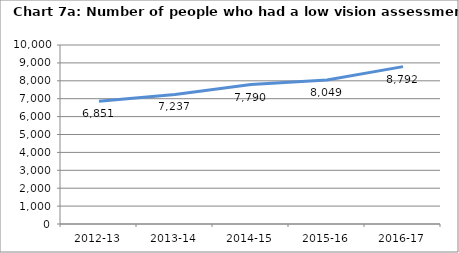
| Category | Chart 7a: Number of people who had a low vision assessment |
|---|---|
| 2012-13 | 6851 |
| 2013-14 | 7237 |
| 2014-15 | 7790 |
| 2015-16 | 8049 |
| 2016-17 | 8792 |